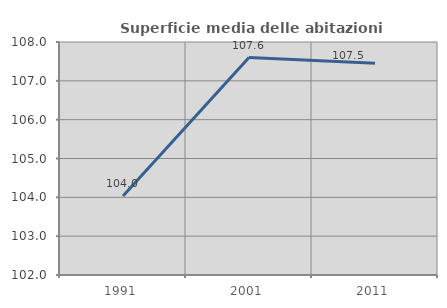
| Category | Superficie media delle abitazioni occupate |
|---|---|
| 1991.0 | 104.034 |
| 2001.0 | 107.6 |
| 2011.0 | 107.452 |